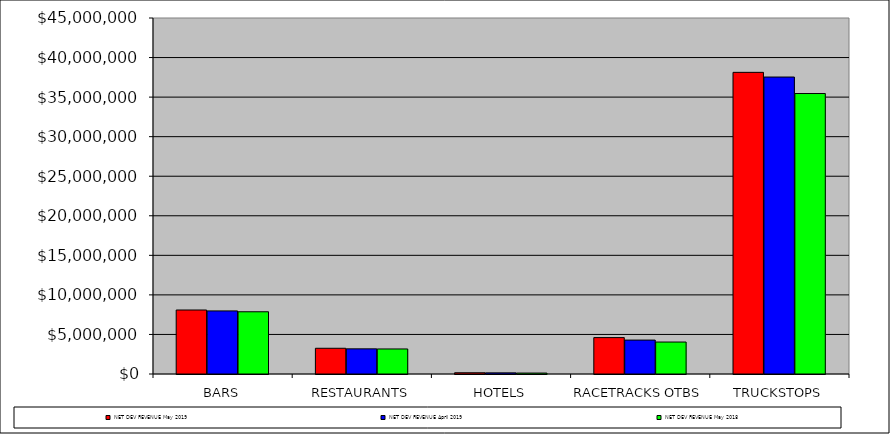
| Category | NET DEV REVENUE |
|---|---|
| BARS | 7865003 |
| RESTAURANTS | 3164475 |
| HOTELS | 119979 |
| RACETRACKS OTBS | 4040901 |
| TRUCKSTOPS | 35453981 |